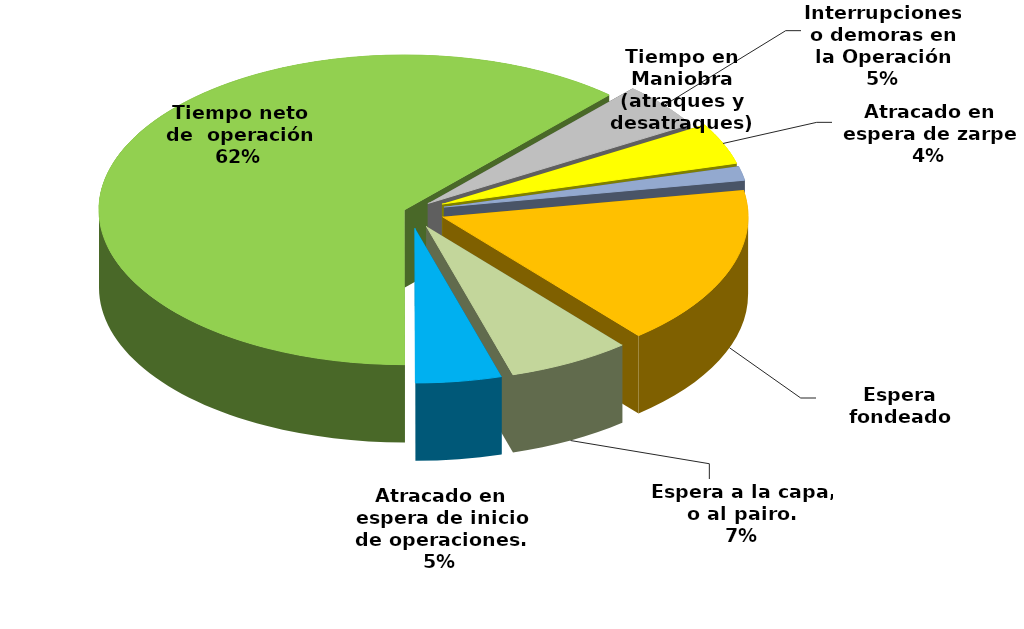
| Category | Series 0 |
|---|---|
| Espera fondeado | 20807.45 |
| Espera a la capa, o al pairo. | 8105.383 |
| Atracado en espera de inicio de operaciones. | 5671.756 |
| Tiempo neto de  operación | 76910.954 |
| Interrupciones o demoras en la Operación | 5943.46 |
| Atracado en espera de zarpe | 5347.425 |
| Tiempo en Maniobra (atraques y desatraques) | 1838.983 |